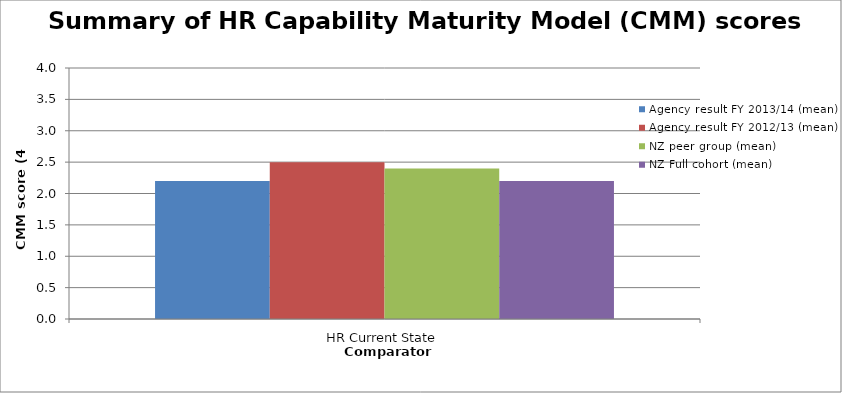
| Category | Agency result FY 2013/14 (mean) | Agency result FY 2012/13 (mean) | NZ peer group (mean) | NZ Full cohort (mean) |
|---|---|---|---|---|
| HR Current State | 2.2 | 2.5 | 2.4 | 2.2 |